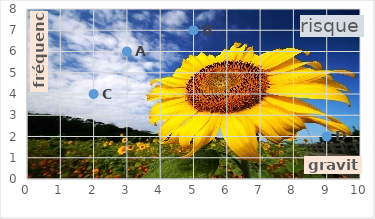
| Category | risque |
|---|---|
| 3.0 | 6 |
| 5.0 | 7 |
| 2.0 | 4 |
| 9.0 | 2 |